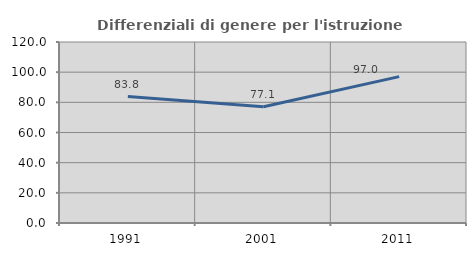
| Category | Differenziali di genere per l'istruzione superiore |
|---|---|
| 1991.0 | 83.848 |
| 2001.0 | 77.064 |
| 2011.0 | 97.048 |